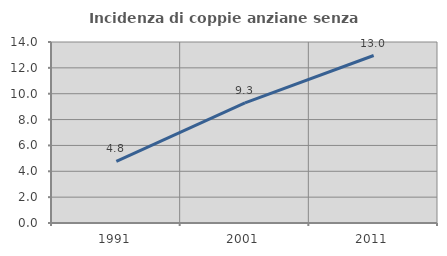
| Category | Incidenza di coppie anziane senza figli  |
|---|---|
| 1991.0 | 4.762 |
| 2001.0 | 9.29 |
| 2011.0 | 12.953 |